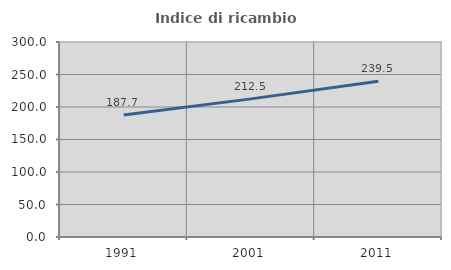
| Category | Indice di ricambio occupazionale  |
|---|---|
| 1991.0 | 187.748 |
| 2001.0 | 212.488 |
| 2011.0 | 239.455 |